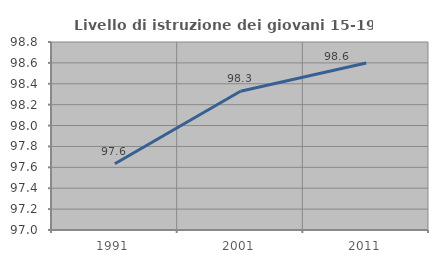
| Category | Livello di istruzione dei giovani 15-19 anni |
|---|---|
| 1991.0 | 97.634 |
| 2001.0 | 98.329 |
| 2011.0 | 98.598 |